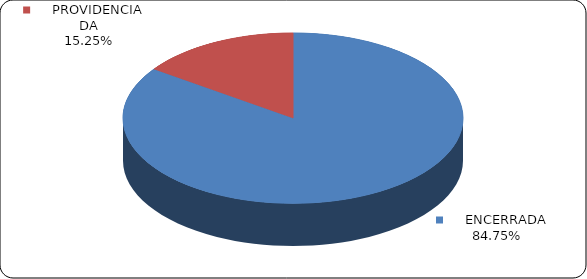
| Category | Series 0 |
|---|---|
|      ENCERRADA | 0.848 |
|      PROVIDENCIADA | 0.152 |